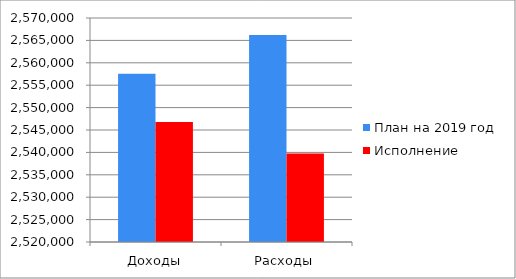
| Category | План на 2019 год | Исполнение |
|---|---|---|
| Доходы | 2557552.8 | 2546774.8 |
| Расходы | 2566216.5 | 2539745.7 |